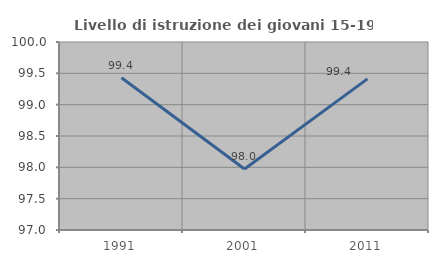
| Category | Livello di istruzione dei giovani 15-19 anni |
|---|---|
| 1991.0 | 99.429 |
| 2001.0 | 97.973 |
| 2011.0 | 99.412 |